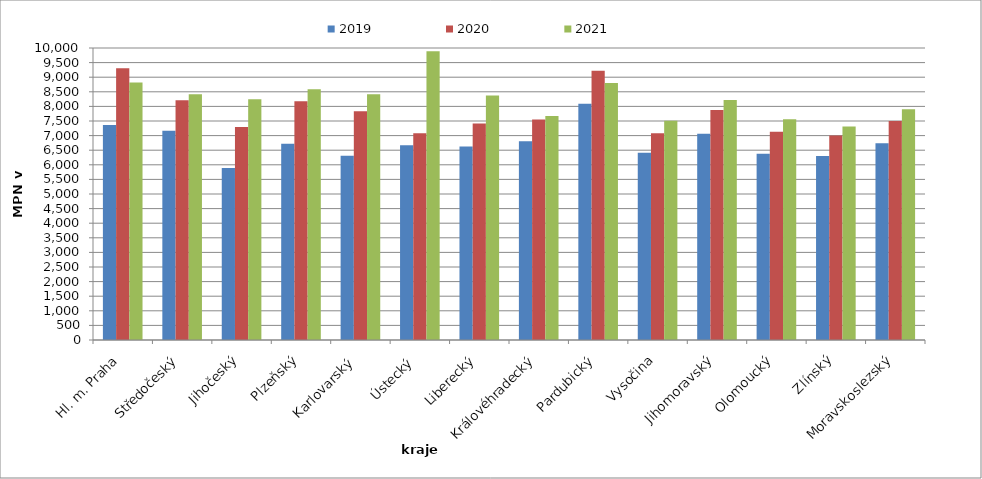
| Category | 2019 | 2020 | 2021 |
|---|---|---|---|
| Hl. m. Praha | 7367 | 9305 | 8820 |
| Středočeský | 7165 | 8207 | 8415 |
| Jihočeský | 5893 | 7298 | 8243 |
| Plzeňský | 6724 | 8179 | 8588 |
| Karlovarský  | 6306 | 7831 | 8420 |
| Ústecký   | 6669 | 7080 | 9887 |
| Liberecký | 6629 | 7411 | 8371 |
| Královéhradecký | 6805 | 7554 | 7673 |
| Pardubický | 8087 | 9218 | 8800 |
| Vysočina | 6414 | 7077 | 7510 |
| Jihomoravský | 7063 | 7876 | 8218 |
| Olomoucký | 6375 | 7128 | 7556 |
| Zlínský | 6299 | 7006 | 7314 |
| Moravskoslezský | 6735 | 7504 | 7906 |